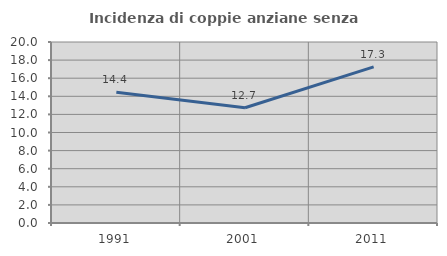
| Category | Incidenza di coppie anziane senza figli  |
|---|---|
| 1991.0 | 14.447 |
| 2001.0 | 12.736 |
| 2011.0 | 17.25 |